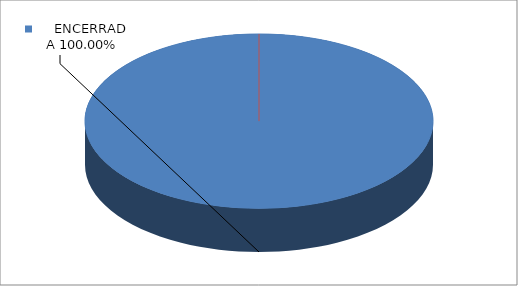
| Category | Series 0 |
|---|---|
|      ENCERRADA | 1 |